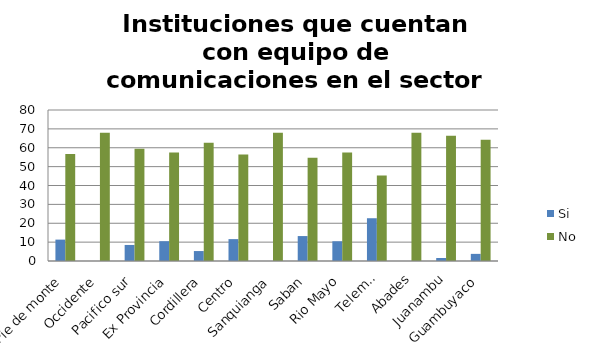
| Category | Si | No |
|---|---|---|
| Pie de monte | 11.33 | 56.65 |
| Occidente | 0 | 67.98 |
| Pacifico sur | 8.498 | 59.482 |
| Ex Provincia | 10.497 | 57.483 |
| Cordillera | 5.272 | 62.708 |
| Centro | 11.595 | 56.385 |
| Sanquianga | 0 | 67.98 |
| Saban | 13.213 | 54.767 |
| Rio Mayo | 10.458 | 57.522 |
| Telembi | 22.66 | 45.32 |
| Abades | 0 | 67.98 |
| Juanambu | 1.577 | 66.403 |
| Guambuyaco | 3.777 | 64.203 |